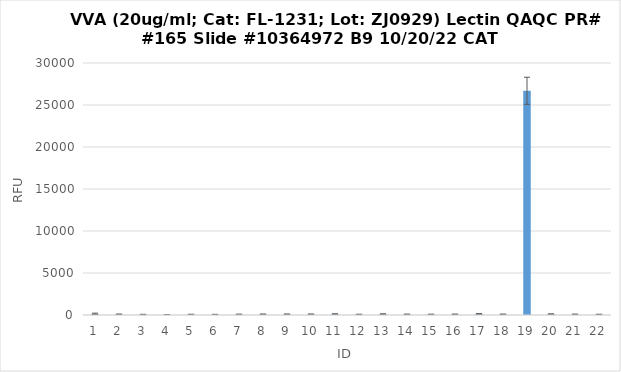
| Category | RFU |
|---|---|
| 0 | 139 |
| 1 | 92 |
| 2 | 64.25 |
| 3 | 54.75 |
| 4 | 74.5 |
| 5 | 70.5 |
| 6 | 84 |
| 7 | 95.5 |
| 8 | 99 |
| 9 | 97.75 |
| 10 | 122.25 |
| 11 | 77.75 |
| 12 | 112.5 |
| 13 | 87.5 |
| 14 | 79.25 |
| 15 | 90.25 |
| 16 | 131 |
| 17 | 90.25 |
| 18 | 26693.75 |
| 19 | 114 |
| 20 | 82.5 |
| 21 | 75.25 |